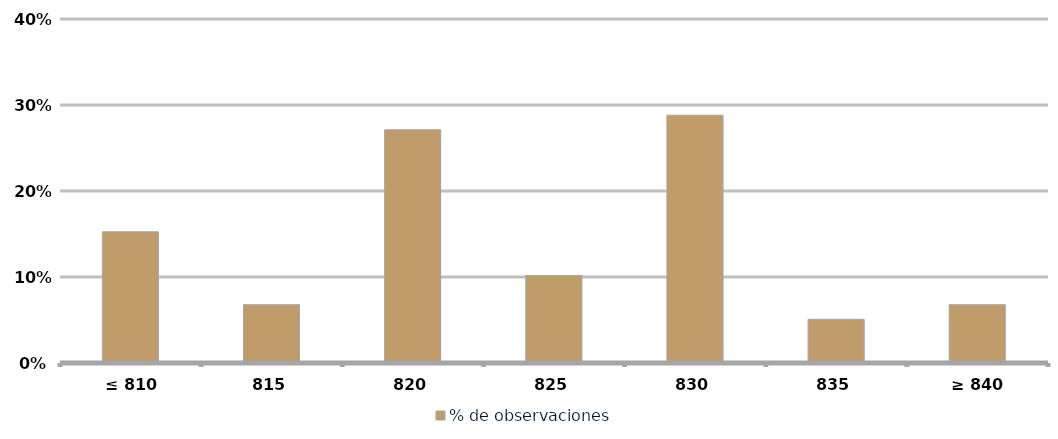
| Category | % de observaciones  |
|---|---|
|  ≤ 810  | 0.153 |
|  815  | 0.068 |
|  820  | 0.271 |
|  825  | 0.102 |
|  830  | 0.288 |
| 835 | 0.051 |
|  ≥ 840  | 0.068 |